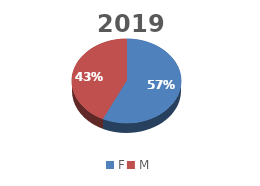
| Category | Series 2 | Series 3 | Series 1 | Series 0 |
|---|---|---|---|---|
| F | 2474 | 2424 | 2474 | 2424 |
| M | 1861 | 1781 | 1861 | 1781 |